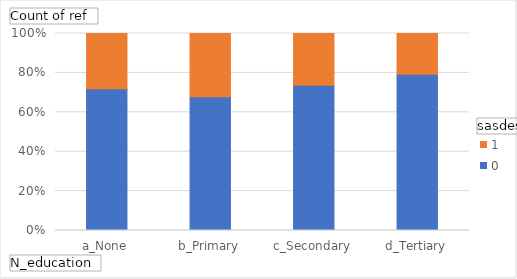
| Category | 0 | 1 |
|---|---|---|
| a_None | 347 | 135 |
| b_Primary | 275 | 130 |
| c_Secondary | 960 | 342 |
| d_Tertiary | 88 | 23 |